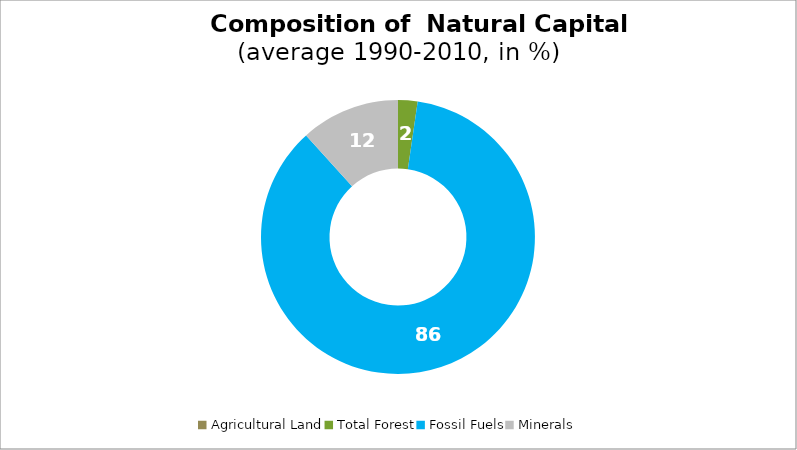
| Category | Series 0 |
|---|---|
| Agricultural Land | 0 |
| Total Forest | 2.298 |
| Fossil Fuels | 86 |
| Minerals | 11.701 |